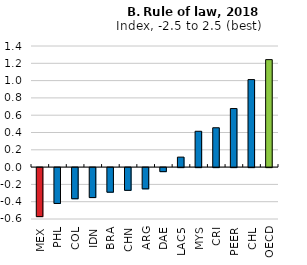
| Category | Series 0 |
|---|---|
| MEX | -0.567 |
| PHL | -0.414 |
| COL | -0.36 |
| IDN | -0.346 |
| BRA | -0.284 |
| CHN | -0.263 |
| ARG | -0.246 |
| DAE | -0.047 |
| LAC5 | 0.115 |
| MYS | 0.414 |
| CRI | 0.455 |
| PEER | 0.677 |
| CHL | 1.012 |
| OECD | 1.242 |